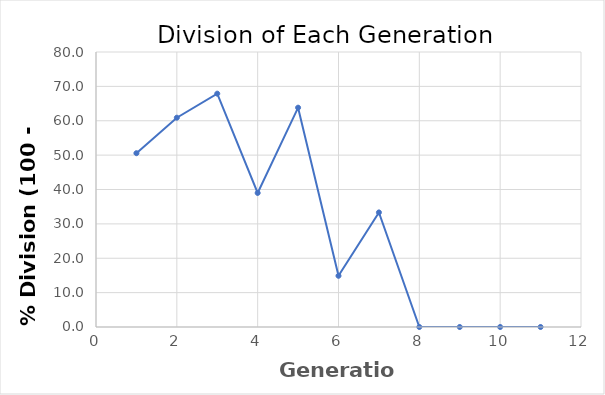
| Category | Series 0 |
|---|---|
| 1.0 | 50.56 |
| 2.0 | 60.886 |
| 3.0 | 67.88 |
| 4.0 | 38.996 |
| 5.0 | 63.801 |
| 6.0 | 14.894 |
| 7.0 | 33.333 |
| 8.0 | 0 |
| 9.0 | 0 |
| 10.0 | 0 |
| 11.0 | 0 |